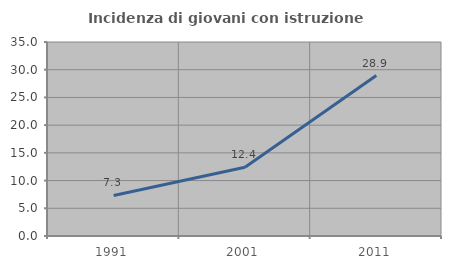
| Category | Incidenza di giovani con istruzione universitaria |
|---|---|
| 1991.0 | 7.31 |
| 2001.0 | 12.389 |
| 2011.0 | 28.945 |